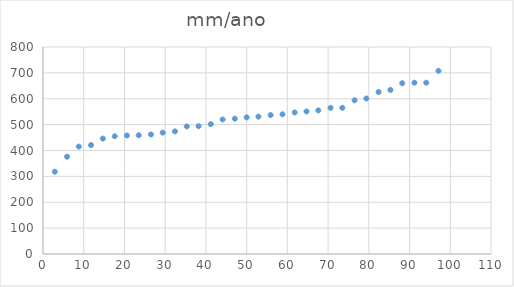
| Category | Series 0 |
|---|---|
| 2.9 | 318 |
| 5.9 | 376 |
| 8.8 | 415 |
| 11.8 | 421 |
| 14.7 | 446 |
| 17.6 | 455 |
| 20.6 | 458 |
| 23.5 | 459 |
| 26.5 | 462 |
| 29.4 | 469 |
| 32.4 | 474 |
| 35.3 | 493 |
| 38.2 | 494 |
| 41.2 | 502 |
| 44.1 | 520 |
| 47.1 | 523 |
| 50.0 | 528 |
| 52.9 | 531 |
| 55.9 | 537 |
| 58.8 | 540 |
| 61.8 | 547 |
| 64.7 | 551 |
| 67.6 | 555 |
| 70.6 | 565 |
| 73.5 | 565 |
| 76.5 | 594 |
| 79.4 | 601 |
| 82.4 | 626 |
| 85.3 | 634 |
| 88.2 | 660 |
| 91.2 | 662 |
| 94.1 | 662 |
| 97.1 | 708 |